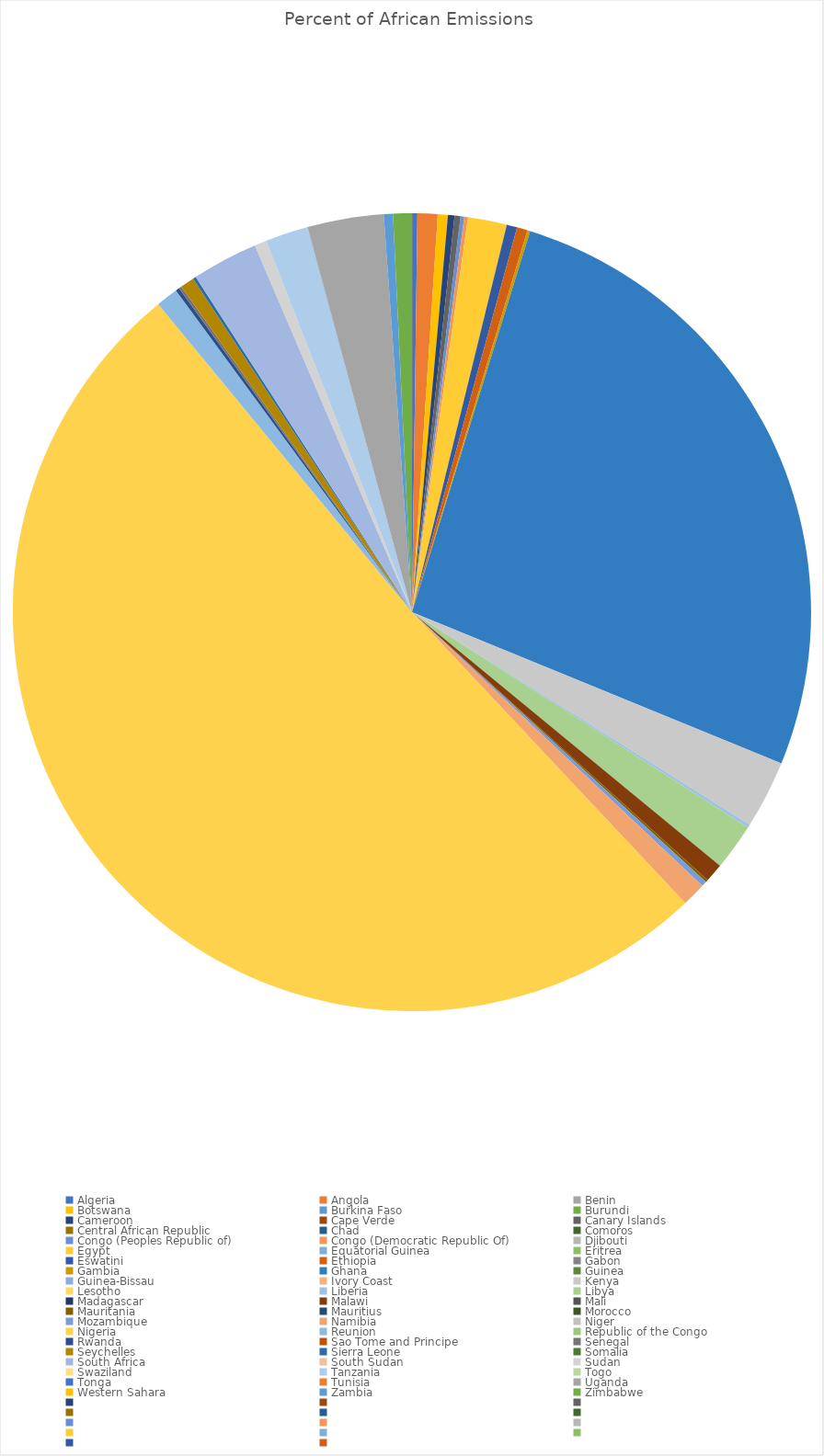
| Category | Percent of African Emissions  |
|---|---|
| Algeria | 0.002 |
| Angola | 0.008 |
| Benin | 0 |
| Botswana | 0.004 |
| Burkina Faso | 0 |
| Burundi | 0 |
| Cameroon | 0.003 |
| Cape Verde | 0 |
| Canary Islands | 0.002 |
| Central African Republic | 0 |
| Chad | 0 |
| Comoros | 0 |
| Congo (Peoples Republic of) | 0.002 |
| Congo (Democratic Republic Of) | 0.002 |
| Djibouti | 0 |
| Egypt | 0.016 |
| Equatorial Guinea | 0 |
| Eritrea | 0 |
| Eswatini | 0.004 |
| Ethiopia | 0.004 |
| Gabon | 0 |
| Gambia | 0.001 |
| Ghana | 0.264 |
| Guinea | 0 |
| Guinea-Bissau | 0 |
| Ivory Coast | 0 |
| Kenya | 0.028 |
| Lesotho | 0 |
| Liberia | 0.001 |
| Libya | 0.019 |
| Madagascar | 0 |
| Malawi | 0.007 |
| Mali | 0 |
| Mauritania | 0.001 |
| Mauritius | 0 |
| Morocco | 0 |
| Mozambique | 0.002 |
| Namibia | 0.01 |
| Niger | 0 |
| Nigeria | 0.51 |
| Reunion | 0.009 |
| Republic of the Congo | 0 |
| Rwanda | 0.002 |
| Sao Tome and Principe | 0 |
| Senegal | 0.001 |
| Seychelles | 0.006 |
| Sierra Leone | 0.001 |
| Somalia | 0 |
| South Africa | 0.027 |
| South Sudan | 0 |
| Sudan | 0.005 |
| Swaziland | 0 |
| Tanzania | 0.017 |
| Togo | 0 |
| Tonga | 0 |
| Tunisia | 0 |
| Uganda | 0.031 |
| Western Sahara | 0 |
| Zambia | 0.004 |
| Zimbabwe | 0.008 |